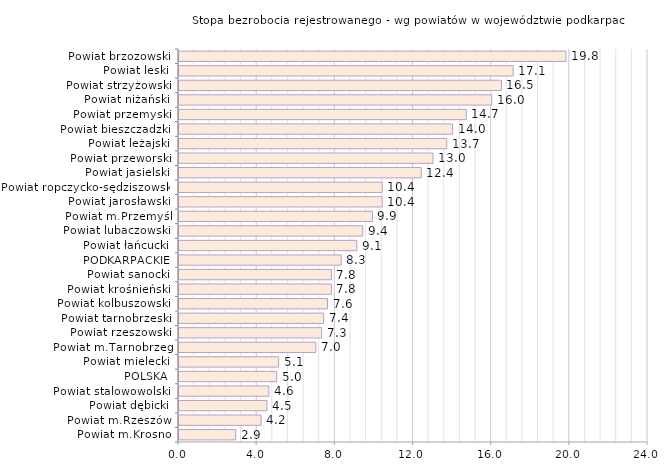
| Category | Stopa bezrobocia rejestrowanego - wg powiatów w województwie podkarpackim |
|---|---|
| Powiat m.Krosno | 2.9 |
| Powiat m.Rzeszów | 4.2 |
| Powiat dębicki | 4.5 |
| Powiat stalowowolski | 4.6 |
| POLSKA | 5 |
| Powiat mielecki | 5.1 |
| Powiat m.Tarnobrzeg | 7 |
| Powiat rzeszowski | 7.3 |
| Powiat tarnobrzeski | 7.4 |
| Powiat kolbuszowski | 7.6 |
| Powiat krośnieński | 7.8 |
| Powiat sanocki | 7.8 |
| PODKARPACKIE | 8.3 |
| Powiat łańcucki | 9.1 |
| Powiat lubaczowski | 9.4 |
| Powiat m.Przemyśl | 9.9 |
| Powiat jarosławski | 10.4 |
| Powiat ropczycko-sędziszowski | 10.4 |
| Powiat jasielski | 12.4 |
| Powiat przeworski | 13 |
| Powiat leżajski | 13.7 |
| Powiat bieszczadzki | 14 |
| Powiat przemyski | 14.7 |
| Powiat niżański | 16 |
| Powiat strzyżowski | 16.5 |
| Powiat leski | 17.1 |
| Powiat brzozowski | 19.8 |